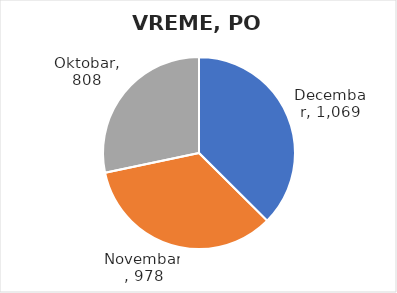
| Category | Ukupno minuta |
|---|---|
| Decembar | 1069 |
| Novembar | 978 |
| Oktobar | 808 |